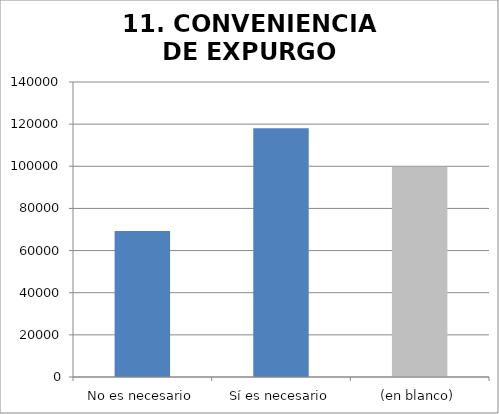
| Category | Series 0 |
|---|---|
| No es necesario | 69243 |
| Sí es necesario | 118075 |
| (en blanco) | 99766 |